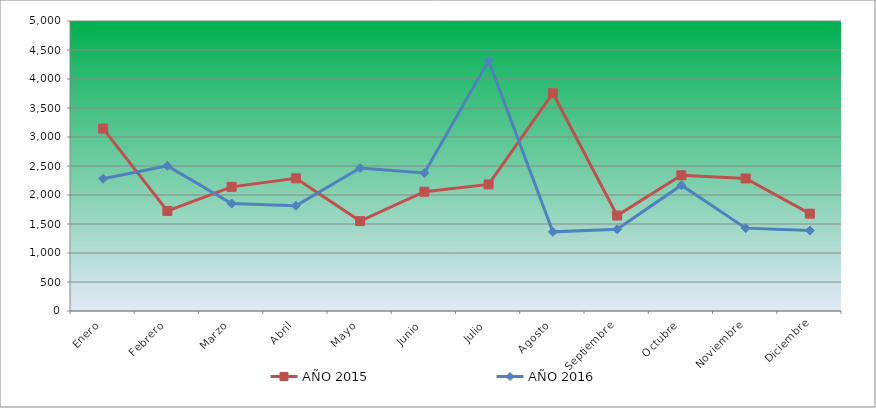
| Category | AÑO 2015 | AÑO 2016 |
|---|---|---|
| Enero | 3145.024 | 2281.268 |
| Febrero | 1725.03 | 2502.234 |
| Marzo | 2140.509 | 1852.253 |
| Abril | 2287.768 | 1815.208 |
| Mayo | 1549.704 | 2464.361 |
| Junio | 2056.362 | 2380.436 |
| Julio | 2182.583 | 4319.022 |
| Agosto | 3755.095 | 1364.262 |
| Septiembre | 1646.141 | 1409.406 |
| Octubre | 2340.276 | 2169.782 |
| Noviembre | 2285.622 | 1428.831 |
| Diciembre | 1677.817 | 1386.544 |